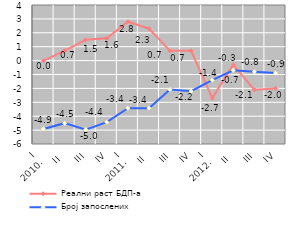
| Category | Реални раст БДП-а | Број запослених |
|---|---|---|
| I
2010. | 0 | -4.917 |
| II | 0.7 | -4.501 |
| III | 1.5 | -4.963 |
| IV | 1.6 | -4.43 |
| I
2011. | 2.8 | -3.427 |
| II | 2.3 | -3.424 |
| III | 0.7 | -2.085 |
| IV | 0.7 | -2.202 |
| I
2012. | -2.7 | -1.4 |
| II | -0.3 | -0.7 |
| III | -2.1 | -0.8 |
| IV | -2 | -0.9 |